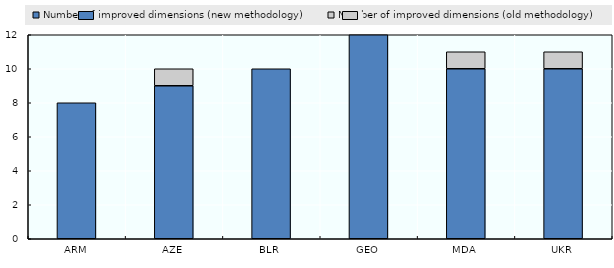
| Category | Number of improved dimensions (new methodology) | Number of improved dimensions (old methodology) |
|---|---|---|
| ARM | 8 | 0 |
| AZE | 9 | 1 |
| BLR | 10 | 0 |
| GEO | 12 | 0 |
| MDA | 10 | 1 |
| UKR | 10 | 1 |